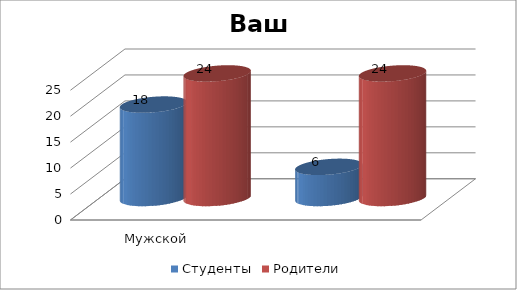
| Category | Студенты | Родители |
|---|---|---|
| Мужской | 18 | 24 |